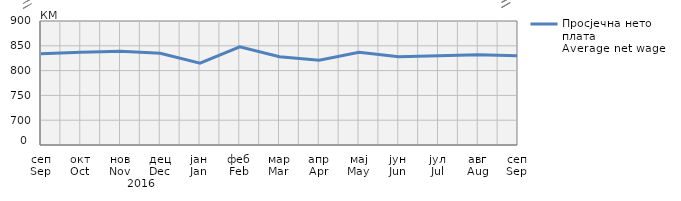
| Category | Просјечна нето плата
Average net wage |
|---|---|
| сеп
Sep | 834 |
| окт
Oct | 837 |
| нов
Nov | 839 |
| дец
Dec | 835 |
| јан
Jan | 815 |
| феб
Feb | 848 |
| мар
Mar | 828 |
| апр
Apr | 821 |
| мај
May | 837 |
| јун
Jun | 828 |
| јул
Jul | 830 |
| авг
Aug | 832 |
| сеп
Sep | 830 |